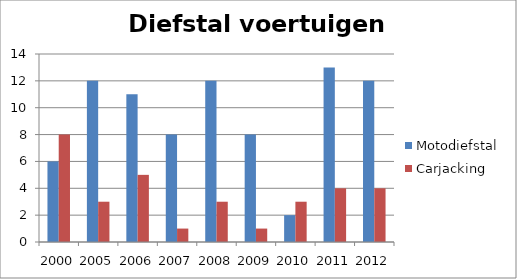
| Category | Motodiefstal | Carjacking |
|---|---|---|
| 2000.0 | 6 | 8 |
| 2005.0 | 12 | 3 |
| 2006.0 | 11 | 5 |
| 2007.0 | 8 | 1 |
| 2008.0 | 12 | 3 |
| 2009.0 | 8 | 1 |
| 2010.0 | 2 | 3 |
| 2011.0 | 13 | 4 |
| 2012.0 | 12 | 4 |